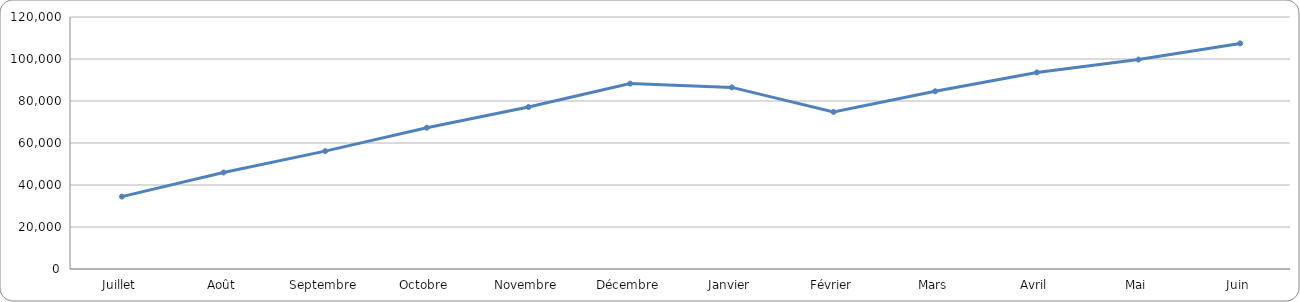
| Category | solde de trésorerie |
|---|---|
| Juillet | 34460.113 |
| Août | 45953.363 |
| Septembre | 56119.212 |
| Octobre | 67285.129 |
| Novembre | 77123.645 |
| Décembre | 88289.562 |
| Janvier | 86481.109 |
| Février | 74803.512 |
| Mars | 84642.028 |
| Avril | 93588.708 |
| Mai | 99732.663 |
| Juin | 107425.253 |